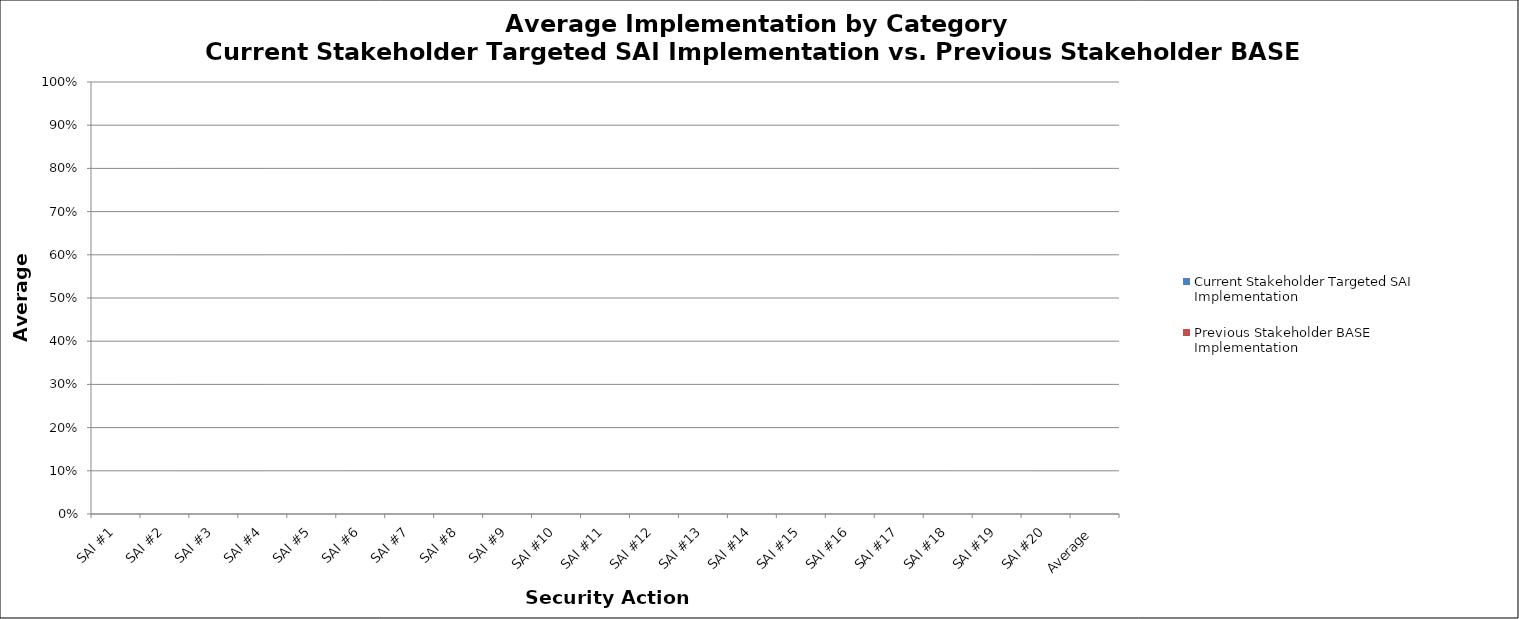
| Category | Current Stakeholder Targeted SAI Implementation | Previous Stakeholder BASE Implementation |
|---|---|---|
| SAI #1 | 0 | 0 |
| SAI #2 | 0 | 0 |
| SAI #3 | 0 | 0 |
| SAI #4 | 0 | 0 |
| SAI #5 | 0 | 0 |
| SAI #6 | 0 | 0 |
| SAI #7 | 0 | 0 |
| SAI #8 | 0 | 0 |
| SAI #9 | 0 | 0 |
| SAI #10 | 0 | 0 |
| SAI #11 | 0 | 0 |
| SAI #12 | 0 | 0 |
| SAI #13 | 0 | 0 |
| SAI #14 | 0 | 0 |
| SAI #15 | 0 | 0 |
| SAI #16 | 0 | 0 |
| SAI #17 | 0 | 0 |
| SAI #18 | 0 | 0 |
| SAI #19 | 0 | 0 |
| SAI #20 | 0 | 0 |
| Average | 0 | 0 |